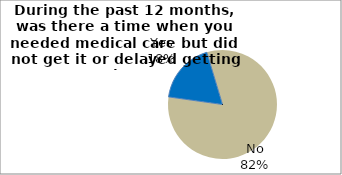
| Category | Series 0 |
|---|---|
| Yes | 18.135 |
| No | 81.865 |